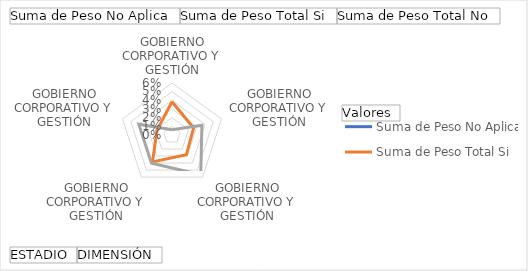
| Category | Suma de Peso No Aplica | Suma de Peso Total Si | Suma de Peso Total No |
|---|---|---|---|
| 0 | 0 | 0.038 | 0.006 |
| 1 | 0 | 0.026 | 0.036 |
| 2 | 0 | 0.028 | 0.056 |
| 3 | 0 | 0.038 | 0.04 |
| 4 | 0 | 0.018 | 0.04 |